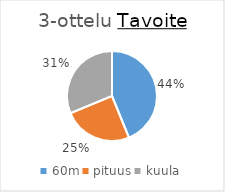
| Category | Series 0 |
|---|---|
| 60m | 505 |
| pituus | 287 |
| kuula | 360 |